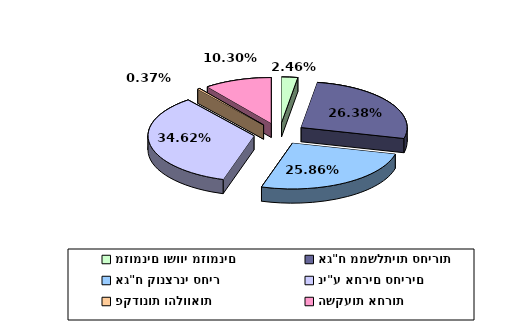
| Category | Series 0 |
|---|---|
| מזומנים ושווי מזומנים | 0.025 |
| אג"ח ממשלתיות סחירות | 0.264 |
| אג"ח קונצרני סחיר | 0.259 |
| ני"ע אחרים סחירים | 0.346 |
| פקדונות והלוואות | 0.004 |
| השקעות אחרות | 0.103 |